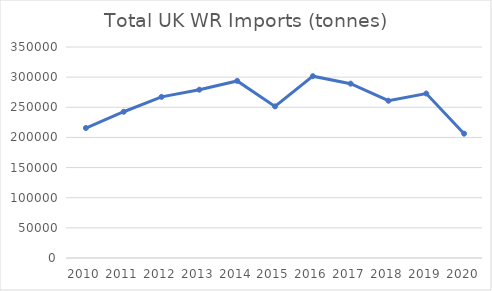
| Category | Total |
|---|---|
| 2010.0 | 215633 |
| 2011.0 | 242620 |
| 2012.0 | 267286 |
| 2013.0 | 279194 |
| 2014.0 | 293729 |
| 2015.0 | 251503 |
| 2016.0 | 301609 |
| 2017.0 | 289180 |
| 2018.0 | 260874 |
| 2019.0 | 272827 |
| 2020.0 | 206217 |